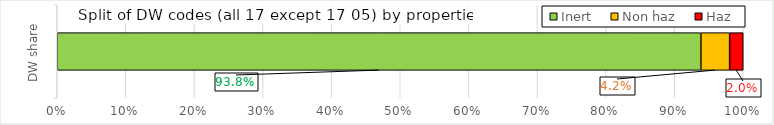
| Category | Inert | Non haz | Haz |
|---|---|---|---|
| DW share | 0.938 | 0.042 | 0.02 |